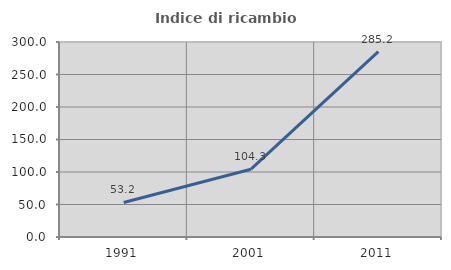
| Category | Indice di ricambio occupazionale  |
|---|---|
| 1991.0 | 53.191 |
| 2001.0 | 104.268 |
| 2011.0 | 285.217 |